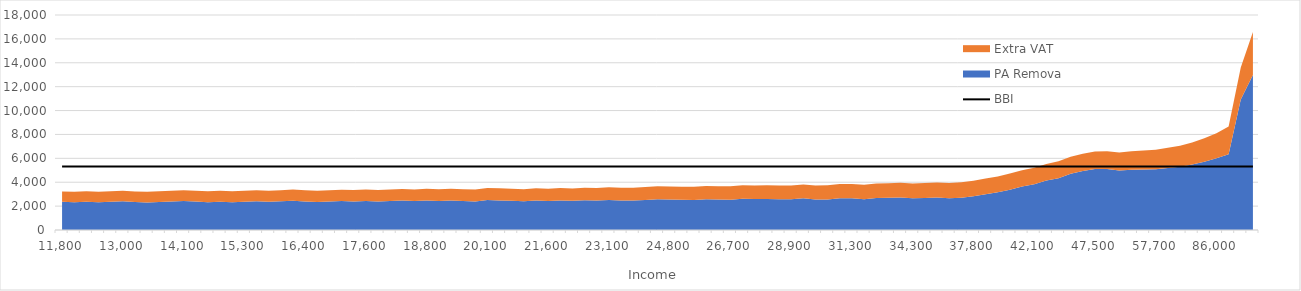
| Category | BBI |
|---|---|
| 0 | 5306.958 |
| 1 | 5306.958 |
| 2 | 5306.958 |
| 3 | 5306.958 |
| 4 | 5306.958 |
| 5 | 5306.958 |
| 6 | 5306.958 |
| 7 | 5306.958 |
| 8 | 5306.958 |
| 9 | 5306.958 |
| 10 | 5306.958 |
| 11 | 5306.958 |
| 12 | 5306.958 |
| 13 | 5306.958 |
| 14 | 5306.958 |
| 15 | 5306.958 |
| 16 | 5306.958 |
| 17 | 5306.958 |
| 18 | 5306.958 |
| 19 | 5306.958 |
| 20 | 5306.958 |
| 21 | 5306.958 |
| 22 | 5306.958 |
| 23 | 5306.958 |
| 24 | 5306.958 |
| 25 | 5306.958 |
| 26 | 5306.958 |
| 27 | 5306.958 |
| 28 | 5306.958 |
| 29 | 5306.958 |
| 30 | 5306.958 |
| 31 | 5306.958 |
| 32 | 5306.958 |
| 33 | 5306.958 |
| 34 | 5306.958 |
| 35 | 5306.958 |
| 36 | 5306.958 |
| 37 | 5306.958 |
| 38 | 5306.958 |
| 39 | 5306.958 |
| 40 | 5306.958 |
| 41 | 5306.958 |
| 42 | 5306.958 |
| 43 | 5306.958 |
| 44 | 5306.958 |
| 45 | 5306.958 |
| 46 | 5306.958 |
| 47 | 5306.958 |
| 48 | 5306.958 |
| 49 | 5306.958 |
| 50 | 5306.958 |
| 51 | 5306.958 |
| 52 | 5306.958 |
| 53 | 5306.958 |
| 54 | 5306.958 |
| 55 | 5306.958 |
| 56 | 5306.958 |
| 57 | 5306.958 |
| 58 | 5306.958 |
| 59 | 5306.958 |
| 60 | 5306.958 |
| 61 | 5306.958 |
| 62 | 5306.958 |
| 63 | 5306.958 |
| 64 | 5306.958 |
| 65 | 5306.958 |
| 66 | 5306.958 |
| 67 | 5306.958 |
| 68 | 5306.958 |
| 69 | 5306.958 |
| 70 | 5306.958 |
| 71 | 5306.958 |
| 72 | 5306.958 |
| 73 | 5306.958 |
| 74 | 5306.958 |
| 75 | 5306.958 |
| 76 | 5306.958 |
| 77 | 5306.958 |
| 78 | 5306.958 |
| 79 | 5306.958 |
| 80 | 5306.958 |
| 81 | 5306.958 |
| 82 | 5306.958 |
| 83 | 5306.958 |
| 84 | 5306.958 |
| 85 | 5306.958 |
| 86 | 5306.958 |
| 87 | 5306.958 |
| 88 | 5306.958 |
| 89 | 5306.958 |
| 90 | 5306.958 |
| 91 | 5306.958 |
| 92 | 5306.958 |
| 93 | 5306.958 |
| 94 | 5306.958 |
| 95 | 5306.958 |
| 96 | 5306.958 |
| 97 | 5306.958 |
| 98 | 5306.958 |